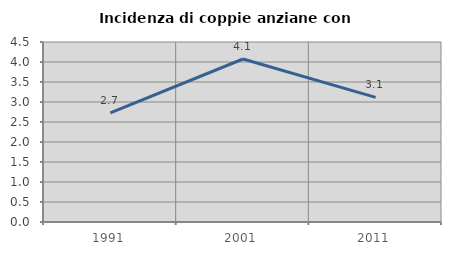
| Category | Incidenza di coppie anziane con figli |
|---|---|
| 1991.0 | 2.729 |
| 2001.0 | 4.075 |
| 2011.0 | 3.116 |